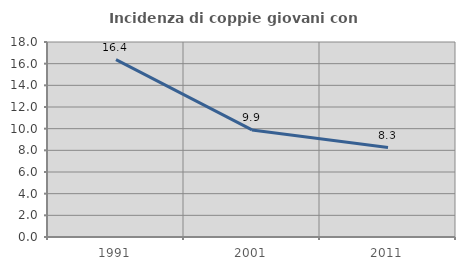
| Category | Incidenza di coppie giovani con figli |
|---|---|
| 1991.0 | 16.378 |
| 2001.0 | 9.882 |
| 2011.0 | 8.257 |